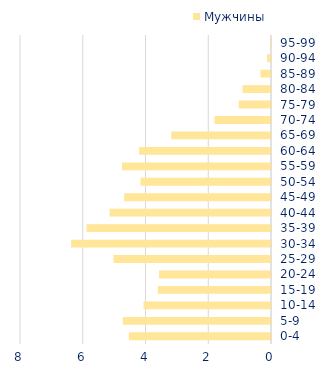
| Category | Мужчины |
|---|---|
| 0-4 | -4.529 |
| 5-9 | -4.723 |
| 10-14 | -4.063 |
| 15-19 | -3.607 |
| 20-24 | -3.568 |
| 25-29 | -5.021 |
| 30-34 | -6.371 |
| 35-39 | -5.879 |
| 40-44 | -5.144 |
| 45-49 | -4.678 |
| 50-54 | -4.159 |
| 55-59 | -4.749 |
| 60-64 | -4.204 |
| 65-69 | -3.178 |
| 70-74 | -1.806 |
| 75-79 | -1.031 |
| 80-84 | -0.906 |
| 85-89 | -0.335 |
| 90-94 | -0.128 |
| 95-99 | -0.025 |